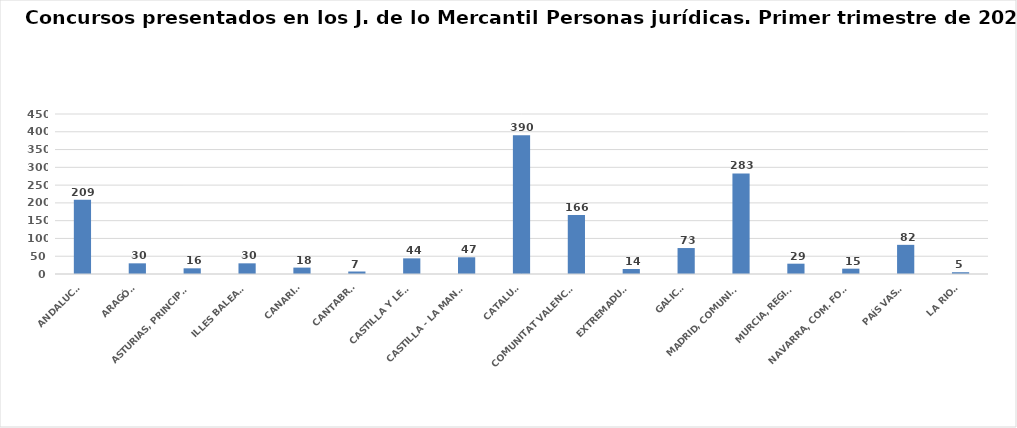
| Category | Series 0 |
|---|---|
| ANDALUCÍA | 209 |
| ARAGÓN | 30 |
| ASTURIAS, PRINCIPADO | 16 |
| ILLES BALEARS | 30 |
| CANARIAS | 18 |
| CANTABRIA | 7 |
| CASTILLA Y LEÓN | 44 |
| CASTILLA - LA MANCHA | 47 |
| CATALUÑA | 390 |
| COMUNITAT VALENCIANA | 166 |
| EXTREMADURA | 14 |
| GALICIA | 73 |
| MADRID, COMUNIDAD | 283 |
| MURCIA, REGIÓN | 29 |
| NAVARRA, COM. FORAL | 15 |
| PAÍS VASCO | 82 |
| LA RIOJA | 5 |